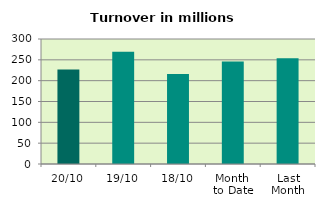
| Category | Series 0 |
|---|---|
| 20/10 | 226.805 |
| 19/10 | 269.323 |
| 18/10 | 215.783 |
| Month 
to Date | 245.823 |
| Last
Month | 253.961 |